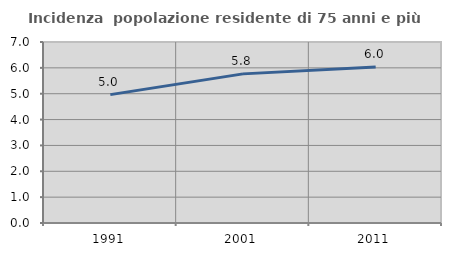
| Category | Incidenza  popolazione residente di 75 anni e più |
|---|---|
| 1991.0 | 4.964 |
| 2001.0 | 5.767 |
| 2011.0 | 6.029 |